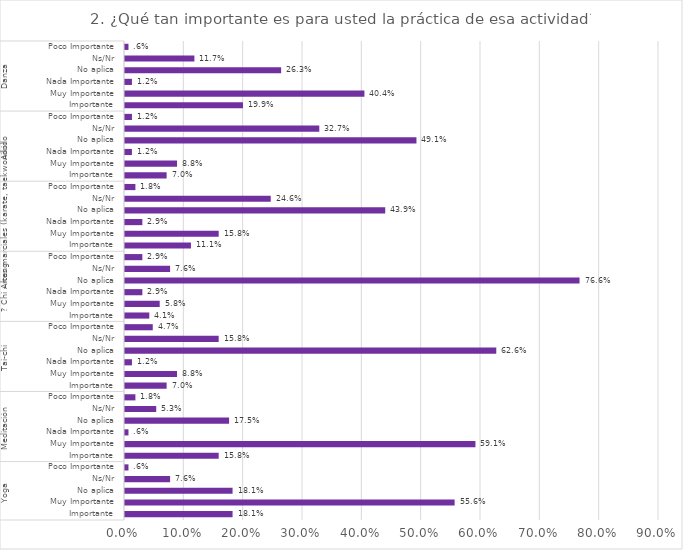
| Category | Series 0 |
|---|---|
| 0 | 0.181 |
| 1 | 0.556 |
| 2 | 0.181 |
| 3 | 0.076 |
| 4 | 0.006 |
| 5 | 0.158 |
| 6 | 0.591 |
| 7 | 0.006 |
| 8 | 0.175 |
| 9 | 0.053 |
| 10 | 0.018 |
| 11 | 0.07 |
| 12 | 0.088 |
| 13 | 0.012 |
| 14 | 0.626 |
| 15 | 0.158 |
| 16 | 0.047 |
| 17 | 0.041 |
| 18 | 0.058 |
| 19 | 0.029 |
| 20 | 0.766 |
| 21 | 0.076 |
| 22 | 0.029 |
| 23 | 0.111 |
| 24 | 0.158 |
| 25 | 0.029 |
| 26 | 0.439 |
| 27 | 0.246 |
| 28 | 0.018 |
| 29 | 0.07 |
| 30 | 0.088 |
| 31 | 0.012 |
| 32 | 0.491 |
| 33 | 0.327 |
| 34 | 0.012 |
| 35 | 0.199 |
| 36 | 0.404 |
| 37 | 0.012 |
| 38 | 0.263 |
| 39 | 0.117 |
| 40 | 0.006 |